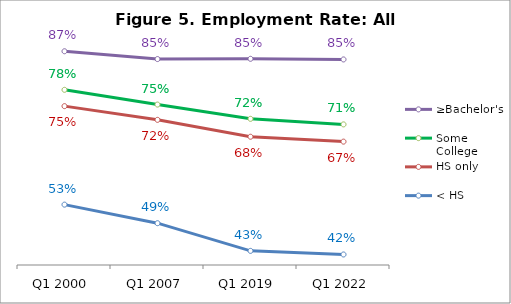
| Category | ≥Bachelor's | Some College | HS only | < HS |
|---|---|---|---|---|
| Q1 2000 | 0.867 | 0.783 | 0.747 | 0.532 |
| Q1 2007 | 0.85 | 0.75 | 0.717 | 0.491 |
| Q1 2019 | 0.85 | 0.719 | 0.68 | 0.431 |
| Q1 2022 | 0.849 | 0.707 | 0.669 | 0.423 |